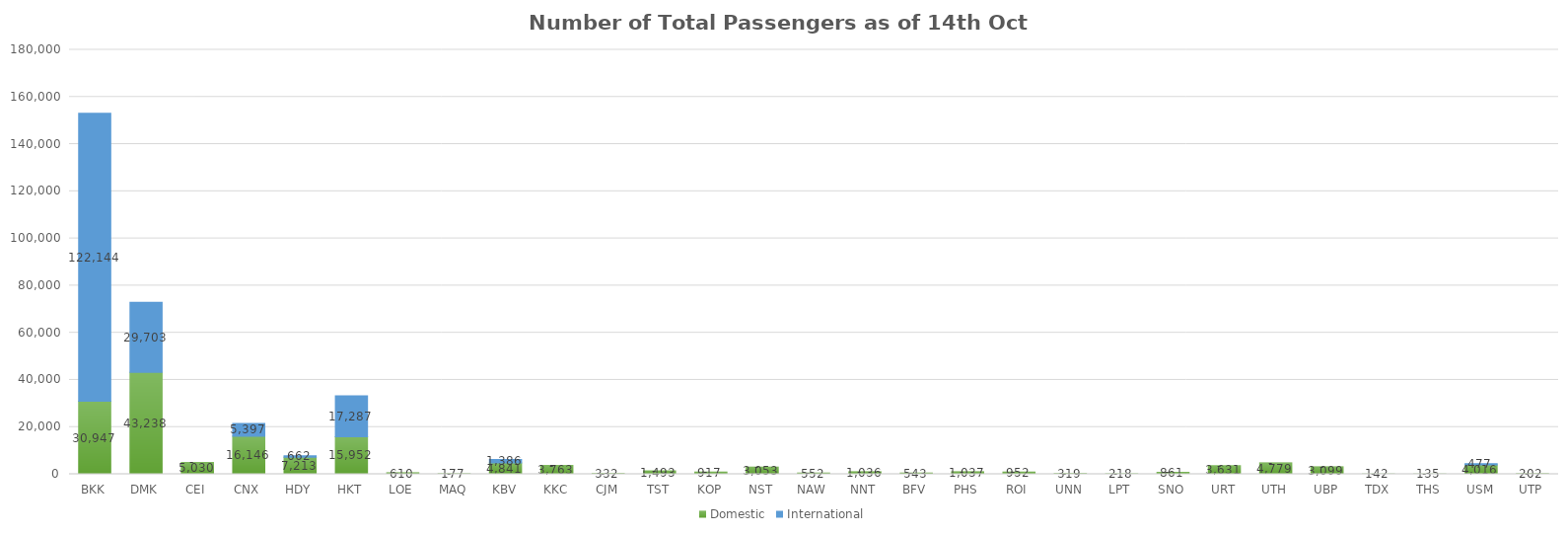
| Category | Domestic | International |
|---|---|---|
| BKK | 30947 | 122144 |
| DMK | 43238 | 29703 |
| CEI | 5030 | 0 |
| CNX | 16146 | 5397 |
| HDY | 7213 | 662 |
| HKT | 15952 | 17287 |
| LOE | 610 | 0 |
| MAQ | 177 | 0 |
| KBV | 4841 | 1386 |
| KKC | 3763 | 0 |
| CJM | 332 | 0 |
| TST | 1493 | 0 |
| KOP | 917 | 0 |
| NST | 3053 | 0 |
| NAW | 552 | 0 |
| NNT | 1036 | 0 |
| BFV | 543 | 0 |
| PHS | 1037 | 0 |
| ROI | 952 | 0 |
| UNN | 319 | 0 |
| LPT | 218 | 0 |
| SNO | 861 | 0 |
| URT | 3631 | 0 |
| UTH | 4779 | 0 |
| UBP | 3099 | 0 |
| TDX | 142 | 0 |
| THS | 135 | 0 |
| USM | 4016 | 477 |
| UTP | 202 | 0 |